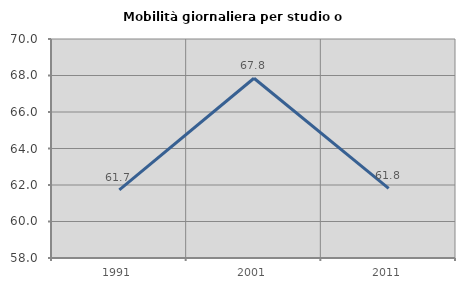
| Category | Mobilità giornaliera per studio o lavoro |
|---|---|
| 1991.0 | 61.728 |
| 2001.0 | 67.849 |
| 2011.0 | 61.818 |